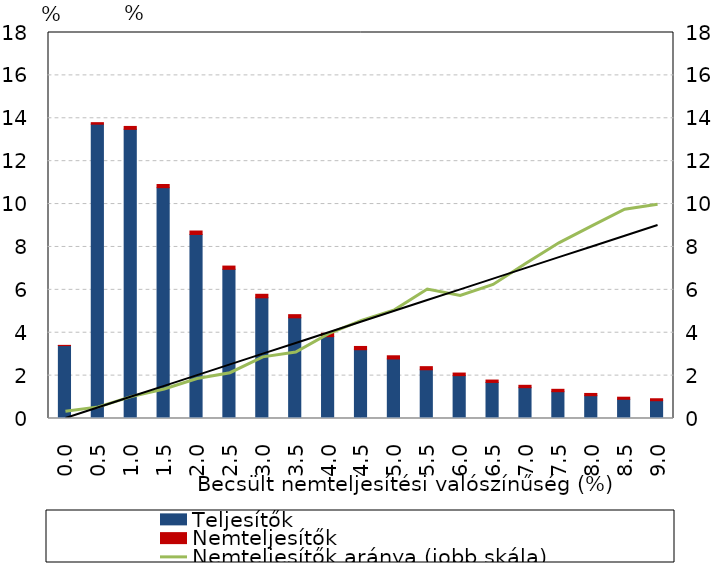
| Category | Teljesítők | Nemteljesítők |
|---|---|---|
| 0.0 | 3.4 | 0.011 |
| 0.5 | 13.724 | 0.072 |
| 1.0 | 13.484 | 0.136 |
| 1.5 | 10.763 | 0.148 |
| 2.0 | 8.582 | 0.161 |
| 2.5 | 6.958 | 0.15 |
| 3.0 | 5.627 | 0.165 |
| 3.5000000000000004 | 4.693 | 0.149 |
| 4.0 | 3.816 | 0.156 |
| 4.5 | 3.207 | 0.153 |
| 5.0 | 2.777 | 0.148 |
| 5.5 | 2.272 | 0.145 |
| 6.0 | 1.998 | 0.121 |
| 6.5 | 1.682 | 0.112 |
| 7.000000000000001 | 1.436 | 0.112 |
| 7.5 | 1.25 | 0.111 |
| 8.0 | 1.064 | 0.105 |
| 8.5 | 0.896 | 0.097 |
| 9.0 | 0.829 | 0.092 |